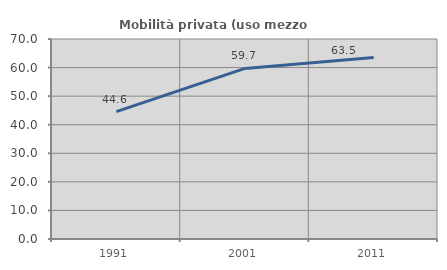
| Category | Mobilità privata (uso mezzo privato) |
|---|---|
| 1991.0 | 44.595 |
| 2001.0 | 59.707 |
| 2011.0 | 63.508 |